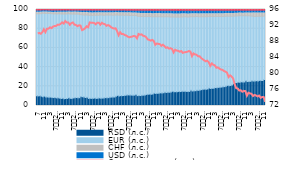
| Category | RSD (л.с.) | EUR (л.с.) | CHF (л.с.) | USD (л.с.) | Остале валуте (л.с.) |
|---|---|---|---|---|---|
| 7 | 10.115 | 85.37 | 1.61 | 2.46 | 0.446 |
| 8 | 9.978 | 85.529 | 1.604 | 2.438 | 0.452 |
| 9 | 10.198 | 85.428 | 1.58 | 2.357 | 0.438 |
| 10 | 9.798 | 85.869 | 1.566 | 2.324 | 0.444 |
| 11 | 9.072 | 86.943 | 1.452 | 2.142 | 0.39 |
| 12 | 9.77 | 86.189 | 1.43 | 2.229 | 0.383 |
| 1
2010. | 8.941 | 86.931 | 1.457 | 2.281 | 0.39 |
| 2 | 8.905 | 86.91 | 1.452 | 2.33 | 0.403 |
| 3 | 8.589 | 87.15 | 1.483 | 2.366 | 0.411 |
| 4 | 8.784 | 86.968 | 1.463 | 2.371 | 0.414 |
| 5 | 8.405 | 87.039 | 1.52 | 2.59 | 0.446 |
| 6 | 8.248 | 87.014 | 1.656 | 2.62 | 0.461 |
| 7
2010. | 8.245 | 87.215 | 1.621 | 2.457 | 0.462 |
| 8 | 7.91 | 87.348 | 1.714 | 2.563 | 0.466 |
| 9 | 7.952 | 87.502 | 1.686 | 2.414 | 0.446 |
| 10 | 7.717 | 87.786 | 1.648 | 2.397 | 0.452 |
| 11 | 7.341 | 88.037 | 1.71 | 2.479 | 0.433 |
| 12 | 7.637 | 87.676 | 1.823 | 2.425 | 0.439 |
| 1
2011. | 7.016 | 88.346 | 1.817 | 2.386 | 0.434 |
| 2 | 7.37 | 87.996 | 1.823 | 2.371 | 0.44 |
| 3 | 7.354 | 88.074 | 1.805 | 2.324 | 0.443 |
| 4 | 7.945 | 87.579 | 1.807 | 2.221 | 0.447 |
| 5 | 7.515 | 87.803 | 1.911 | 2.315 | 0.454 |
| 6 | 7.377 | 87.927 | 1.938 | 2.308 | 0.45 |
| 7
2011. | 7.904 | 87.283 | 2.056 | 2.295 | 0.462 |
| 8 | 7.98 | 87.307 | 1.991 | 2.247 | 0.475 |
| 9 | 8.301 | 86.921 | 1.94 | 2.369 | 0.469 |
| 10 | 8.073 | 87.169 | 1.977 | 2.309 | 0.473 |
| 11 | 8.146 | 86.605 | 2.259 | 2.48 | 0.509 |
| 12 | 9.27 | 85.174 | 2.419 | 2.595 | 0.541 |
| 1 
2012. | 9.109 | 85.301 | 2.458 | 2.583 | 0.55 |
| 2 | 8.794 | 85.59 | 2.493 | 2.564 | 0.558 |
| 3 | 8.333 | 85.981 | 2.527 | 2.594 | 0.565 |
| 4 | 8.562 | 85.696 | 2.544 | 2.621 | 0.575 |
| 5 | 7.362 | 86.627 | 2.577 | 2.844 | 0.59 |
| 6 | 7.433 | 86.525 | 2.599 | 2.848 | 0.595 |
| 7
2012. | 7.433 | 86.42 | 2.609 | 2.917 | 0.62 |
| 8 | 7.505 | 86.376 | 2.615 | 2.885 | 0.62 |
| 9 | 7.823 | 86.159 | 2.592 | 2.797 | 0.629 |
| 10 | 7.416 | 86.573 | 2.606 | 2.792 | 0.612 |
| 11 | 7.427 | 86.67 | 2.57 | 2.735 | 0.598 |
| 12 | 7.927 | 86.21 | 2.556 | 2.701 | 0.606 |
| 1 
2013. | 7.449 | 86.785 | 2.51 | 2.665 | 0.59 |
| 2 | 7.71 | 86.423 | 2.529 | 2.74 | 0.597 |
| 3 | 7.792 | 86.267 | 2.535 | 2.785 | 0.621 |
| 4 | 8.206 | 85.943 | 2.497 | 2.729 | 0.624 |
| 5 | 8.023 | 86.137 | 2.473 | 2.742 | 0.624 |
| 6 | 8.179 | 85.957 | 2.486 | 2.762 | 0.616 |
| 7
2013. | 8.54 | 85.621 | 2.505 | 2.713 | 0.622 |
| 8 | 8.775 | 85.363 | 2.517 | 2.722 | 0.624 |
| 9 | 8.887 | 85.251 | 2.554 | 2.676 | 0.632 |
| 10 | 8.838 | 85.372 | 2.537 | 2.638 | 0.615 |
| 11 | 9.576 | 84.624 | 2.545 | 2.646 | 0.608 |
| 12 | 10.569 | 83.679 | 2.539 | 2.611 | 0.603 |
| 1 
2014. | 9.827 | 84.271 | 2.605 | 2.685 | 0.612 |
| 2 | 10.277 | 83.795 | 2.621 | 2.689 | 0.618 |
| 3 | 10.26 | 83.834 | 2.623 | 2.661 | 0.622 |
| 4 | 10.521 | 83.572 | 2.633 | 2.65 | 0.623 |
| 5 | 10.642 | 83.374 | 2.643 | 2.688 | 0.653 |
| 6 | 10.919 | 83.096 | 2.653 | 2.668 | 0.665 |
| 7
2014. | 11.072 | 82.869 | 2.679 | 2.711 | 0.669 |
| 8 | 10.953 | 82.919 | 2.703 | 2.753 | 0.672 |
| 9 | 10.875 | 82.872 | 2.725 | 2.856 | 0.673 |
| 10 | 10.735 | 83.017 | 2.719 | 2.852 | 0.678 |
| 11 | 10.805 | 82.879 | 2.753 | 2.866 | 0.694 |
| 12 | 11.337 | 82.303 | 2.772 | 2.932 | 0.656 |
| 1 
2015. | 10.257 | 82.71 | 3.135 | 3.235 | 0.663 |
| 2 | 10.423 | 82.502 | 3.087 | 3.287 | 0.7 |
| 3 | 10.346 | 82.303 | 3.202 | 3.443 | 0.707 |
| 4 | 10.673 | 82.034 | 3.22 | 3.35 | 0.724 |
| 5 | 10.788 | 81.817 | 3.28 | 3.385 | 0.73 |
| 6 | 11.029 | 81.657 | 3.27 | 3.324 | 0.72 |
| 7
2015. | 11.598 | 80.971 | 3.29 | 3.407 | 0.734 |
| 8 | 11.71 | 80.94 | 3.258 | 3.351 | 0.741 |
| 9 | 11.894 | 80.754 | 3.244 | 3.37 | 0.737 |
| 10 | 11.724 | 80.814 | 3.258 | 3.452 | 0.752 |
| 11 | 11.994 | 80.422 | 3.253 | 3.57 | 0.76 |
| 12 | 12.946 | 79.566 | 3.26 | 3.491 | 0.737 |
| 1 
2016. | 12.619 | 79.895 | 3.208 | 3.543 | 0.735 |
| 2 | 12.719 | 79.748 | 3.252 | 3.539 | 0.742 |
| 3 | 12.799 | 79.741 | 3.245 | 3.442 | 0.773 |
| 4 | 13.207 | 79.344 | 3.216 | 3.449 | 0.785 |
| 5 | 12.923 | 79.558 | 3.186 | 3.524 | 0.808 |
| 6 | 13.272 | 79.143 | 3.232 | 3.553 | 0.799 |
| 7
2016. | 13.713 | 78.712 | 3.235 | 3.545 | 0.794 |
| 8 | 13.58 | 78.872 | 3.203 | 3.549 | 0.797 |
| 9 | 13.902 | 78.516 | 3.241 | 3.552 | 0.788 |
| 10 | 13.813 | 78.564 | 3.221 | 3.625 | 0.778 |
| 11 | 13.986 | 78.253 | 3.227 | 3.719 | 0.814 |
| 12 | 14.861 | 77.404 | 3.205 | 3.725 | 0.806 |
| 1 
2017. | 14.206 | 77.975 | 3.26 | 3.727 | 0.832 |
| 2 | 14.392 | 77.72 | 3.259 | 3.79 | 0.84 |
| 3 | 14.452 | 77.608 | 3.275 | 3.818 | 0.847 |
| 4 | 14.689 | 77.417 | 3.241 | 3.785 | 0.867 |
| 5 | 14.517 | 77.619 | 3.245 | 3.749 | 0.87 |
| 6 | 14.964 | 77.277 | 3.222 | 3.663 | 0.875 |
| 7
2017. | 14.831 | 77.619 | 3.104 | 3.582 | 0.864 |
| 8 | 14.776 | 77.735 | 3.083 | 3.562 | 0.843 |
| 9 | 14.686 | 77.666 | 3.098 | 3.691 | 0.86 |
| 10 | 14.503 | 77.814 | 3.066 | 3.742 | 0.874 |
| 11 | 14.644 | 77.729 | 3.047 | 3.704 | 0.876 |
| 12 | 15.786 | 76.708 | 3.018 | 3.62 | 0.868 |
| 1 
2018. | 15.099 | 77.465 | 3.08 | 3.485 | 0.871 |
| 2 | 15.361 | 77.181 | 3.069 | 3.524 | 0.865 |
| 3 | 15.419 | 77.202 | 3.006 | 3.506 | 0.867 |
| 4 | 15.804 | 76.842 | 2.943 | 3.548 | 0.863 |
| 5 | 15.801 | 76.617 | 3.044 | 3.664 | 0.873 |
| 6 | 16.235 | 76.272 | 3.003 | 3.636 | 0.854 |
| 7
2018. | 16.547 | 75.996 | 2.996 | 3.603 | 0.858 |
| 8 | 16.818 | 75.706 | 3.037 | 3.585 | 0.853 |
| 9 | 17.083 | 75.447 | 3.008 | 3.606 | 0.857 |
| 10 | 16.913 | 75.555 | 2.982 | 3.696 | 0.855 |
| 11 | 17.293 | 75.242 | 2.981 | 3.643 | 0.841 |
| 12 | 18.205 | 74.467 | 2.956 | 3.564 | 0.809 |
| 1 
2019. | 17.599 | 75.154 | 2.904 | 3.535 | 0.808 |
| 2 | 17.937 | 74.817 | 2.89 | 3.54 | 0.816 |
| 3 | 18.087 | 74.605 | 2.908 | 3.592 | 0.807 |
| 4 | 18.691 | 74.079 | 2.833 | 3.598 | 0.798 |
| 5 | 18.6 | 74.117 | 2.906 | 3.586 | 0.79 |
| 6 | 18.901 | 73.88 | 2.917 | 3.51 | 0.792 |
| 7
2019. | 19.13 | 73.637 | 2.892 | 3.552 | 0.789 |
| 8 | 19.212 | 73.52 | 2.911 | 3.565 | 0.791 |
| 9 | 19.519 | 73.234 | 2.911 | 3.558 | 0.779 |
| 10 | 19.653 | 73.233 | 2.864 | 3.467 | 0.782 |
| 11 | 19.933 | 72.991 | 2.847 | 3.449 | 0.78 |
| 12 | 21.017 | 72.021 | 2.85 | 3.342 | 0.771 |
| 1 
2020. | 20.593 | 72.359 | 2.881 | 3.395 | 0.772 |
| 2 | 20.904 | 72.084 | 2.882 | 3.368 | 0.763 |
| 3 | 21.393 | 71.592 | 2.918 | 3.375 | 0.722 |
| 4 | 22.842 | 70.178 | 2.862 | 3.385 | 0.733 |
| 5 | 23.799 | 69.426 | 2.784 | 3.274 | 0.717 |
| 6 | 23.876 | 69.359 | 2.782 | 3.255 | 0.728 |
| 7
2020. | 24.391 | 69.08 | 2.733 | 3.078 | 0.719 |
| 8 | 24.313 | 69.184 | 2.731 | 3.049 | 0.724 |
| 9 | 24.682 | 68.849 | 2.713 | 3.066 | 0.69 |
| 10 | 24.47 | 69.007 | 2.738 | 3.103 | 0.682 |
| 11 | 24.522 | 69.064 | 2.716 | 3.009 | 0.689 |
| 12 | 25.688 | 67.871 | 2.877 | 2.889 | 0.676 |
| 1 
2021. | 24.925 | 68.419 | 3.03 | 2.948 | 0.679 |
| 2 | 25.101 | 68.275 | 3.013 | 2.919 | 0.692 |
| 3 | 25.193 | 67.994 | 3.091 | 3.004 | 0.718 |
| 4 | 25.756 | 67.505 | 3.152 | 2.884 | 0.703 |
| 5 | 25.486 | 67.251 | 3.697 | 2.856 | 0.711 |
| 6 | 25.63 | 67.12 | 3.593 | 2.944 | 0.713 |
| 7
2021. | 25.858 | 66.952 | 3.58 | 2.895 | 0.715 |
| 8 | 25.641 | 67.236 | 3.507 | 2.907 | 0.709 |
| 9 | 26.197 | 66.741 | 3.421 | 2.938 | 0.703 |
| 10 | 26.004 | 66.953 | 3.42 | 2.902 | 0.721 |
| 11 | 26.023 | 66.915 | 3.413 | 2.943 | 0.706 |
| 12 | 27.202 | 65.913 | 3.319 | 2.871 | 0.695 |